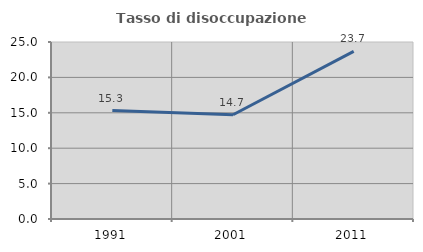
| Category | Tasso di disoccupazione giovanile  |
|---|---|
| 1991.0 | 15.315 |
| 2001.0 | 14.729 |
| 2011.0 | 23.684 |